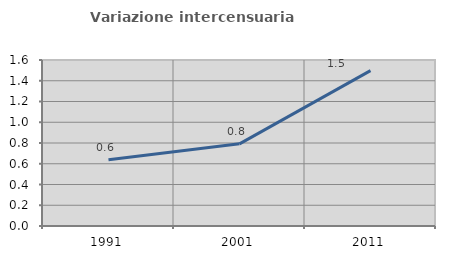
| Category | Variazione intercensuaria annua |
|---|---|
| 1991.0 | 0.639 |
| 2001.0 | 0.792 |
| 2011.0 | 1.497 |